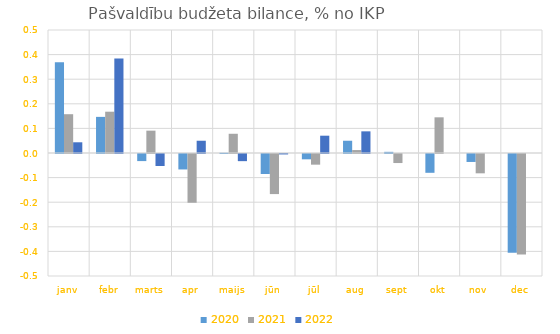
| Category | 2020 | 2021 | 2022 |
|---|---|---|---|
| janv | 0.369 | 0.158 | 0.044 |
| febr | 0.147 | 0.168 | 0.384 |
| marts | -0.029 | 0.091 | -0.049 |
| apr | -0.063 | -0.198 | 0.05 |
| maijs | 0.001 | 0.078 | -0.029 |
| jūn | -0.081 | -0.163 | -0.002 |
| jūl | -0.022 | -0.043 | 0.07 |
| aug | 0.05 | 0.012 | 0.088 |
| sept | 0.005 | -0.037 | 0 |
| okt | -0.076 | 0.145 | 0 |
| nov | -0.032 | -0.079 | 0 |
| dec | -0.401 | -0.409 | 0 |